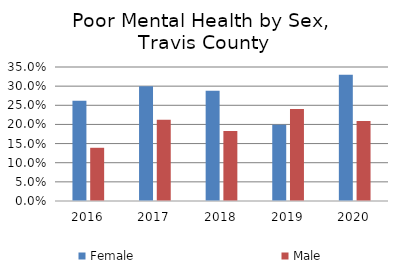
| Category | Female | Male |
|---|---|---|
| 2016.0 | 0.262 | 0.139 |
| 2017.0 | 0.3 | 0.212 |
| 2018.0 | 0.288 | 0.183 |
| 2019.0 | 0.199 | 0.24 |
| 2020.0 | 0.33 | 0.209 |